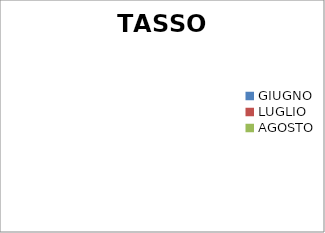
| Category | TASSO ASSENZE |
|---|---|
| GIUGNO | 0 |
| LUGLIO | 0 |
| AGOSTO | 0 |